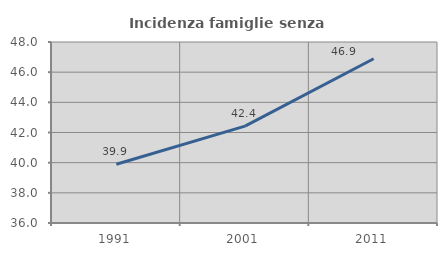
| Category | Incidenza famiglie senza nuclei |
|---|---|
| 1991.0 | 39.895 |
| 2001.0 | 42.424 |
| 2011.0 | 46.89 |